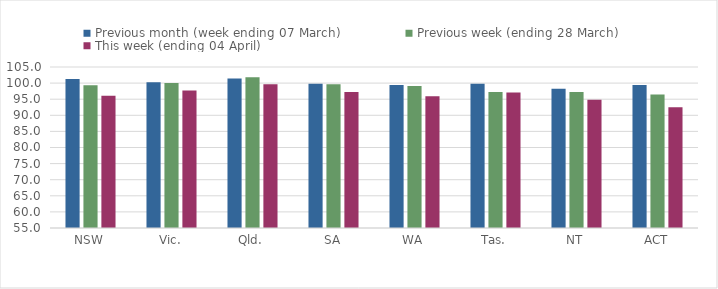
| Category | Previous month (week ending 07 March) | Previous week (ending 28 March) | This week (ending 04 April) |
|---|---|---|---|
| NSW | 101.24 | 99.326 | 96.06 |
| Vic. | 100.239 | 100.003 | 97.729 |
| Qld. | 101.412 | 101.819 | 99.677 |
| SA | 99.79 | 99.622 | 97.221 |
| WA | 99.416 | 99.093 | 95.949 |
| Tas. | 99.813 | 97.253 | 97.067 |
| NT | 98.266 | 97.242 | 94.799 |
| ACT | 99.386 | 96.484 | 92.467 |